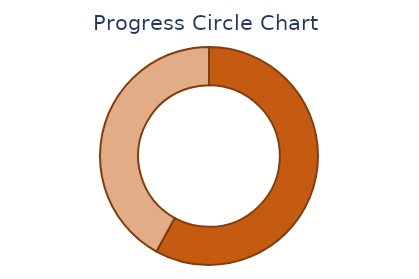
| Category | Series 0 |
|---|---|
| 0 | 0.58 |
| 1 | 0.42 |